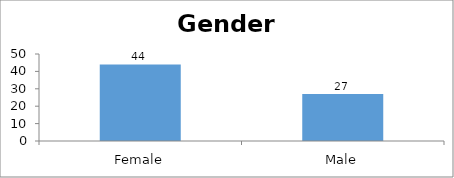
| Category | Gender |
|---|---|
| Female | 44 |
| Male | 27 |